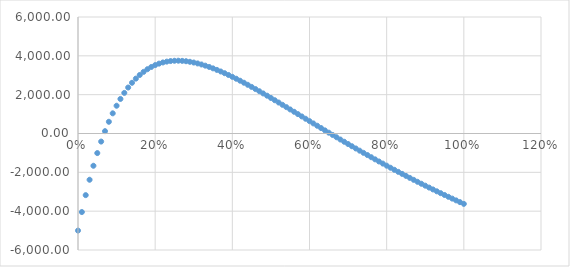
| Category | Series 0 |
|---|---|
| 0.0 | -5000 |
| 0.01 | -4044.767 |
| 0.02 | -3174.343 |
| 0.03 | -2382.082 |
| 0.04 | -1661.886 |
| 0.05 | -1008.153 |
| 0.060000000000000005 | -415.735 |
| 0.07 | 120.099 |
| 0.08 | 603.703 |
| 0.09 | 1039.086 |
| 0.09999999999999999 | 1429.938 |
| 0.10999999999999999 | 1779.662 |
| 0.11999999999999998 | 2091.393 |
| 0.12999999999999998 | 2368.025 |
| 0.13999999999999999 | 2612.226 |
| 0.15 | 2826.464 |
| 0.16 | 3013.013 |
| 0.17 | 3173.98 |
| 0.18000000000000002 | 3311.31 |
| 0.19000000000000003 | 3426.801 |
| 0.20000000000000004 | 3522.119 |
| 0.21000000000000005 | 3598.806 |
| 0.22000000000000006 | 3658.287 |
| 0.23000000000000007 | 3701.885 |
| 0.24000000000000007 | 3730.824 |
| 0.25000000000000006 | 3746.24 |
| 0.26000000000000006 | 3749.184 |
| 0.2700000000000001 | 3740.633 |
| 0.2800000000000001 | 3721.492 |
| 0.2900000000000001 | 3692.601 |
| 0.3000000000000001 | 3654.739 |
| 0.3100000000000001 | 3608.63 |
| 0.3200000000000001 | 3554.946 |
| 0.3300000000000001 | 3494.311 |
| 0.34000000000000014 | 3427.305 |
| 0.35000000000000014 | 3354.465 |
| 0.36000000000000015 | 3276.291 |
| 0.37000000000000016 | 3193.25 |
| 0.38000000000000017 | 3105.771 |
| 0.3900000000000002 | 3014.258 |
| 0.4000000000000002 | 2919.081 |
| 0.4100000000000002 | 2820.589 |
| 0.4200000000000002 | 2719.103 |
| 0.4300000000000002 | 2614.923 |
| 0.4400000000000002 | 2508.326 |
| 0.45000000000000023 | 2399.572 |
| 0.46000000000000024 | 2288.901 |
| 0.47000000000000025 | 2176.536 |
| 0.48000000000000026 | 2062.683 |
| 0.49000000000000027 | 1947.537 |
| 0.5000000000000002 | 1831.276 |
| 0.5100000000000002 | 1714.065 |
| 0.5200000000000002 | 1596.06 |
| 0.5300000000000002 | 1477.402 |
| 0.5400000000000003 | 1358.225 |
| 0.5500000000000003 | 1238.652 |
| 0.5600000000000003 | 1118.796 |
| 0.5700000000000003 | 998.764 |
| 0.5800000000000003 | 878.653 |
| 0.5900000000000003 | 758.554 |
| 0.6000000000000003 | 638.55 |
| 0.6100000000000003 | 518.718 |
| 0.6200000000000003 | 399.13 |
| 0.6300000000000003 | 279.853 |
| 0.6400000000000003 | 160.945 |
| 0.6500000000000004 | 42.464 |
| 0.6600000000000004 | -75.54 |
| 0.6700000000000004 | -193.019 |
| 0.6800000000000004 | -309.929 |
| 0.6900000000000004 | -426.232 |
| 0.7000000000000004 | -541.892 |
| 0.7100000000000004 | -656.875 |
| 0.7200000000000004 | -771.15 |
| 0.7300000000000004 | -884.692 |
| 0.7400000000000004 | -997.476 |
| 0.7500000000000004 | -1109.478 |
| 0.7600000000000005 | -1220.68 |
| 0.7700000000000005 | -1331.063 |
| 0.7800000000000005 | -1440.611 |
| 0.7900000000000005 | -1549.311 |
| 0.8000000000000005 | -1657.149 |
| 0.8100000000000005 | -1764.116 |
| 0.8200000000000005 | -1870.201 |
| 0.8300000000000005 | -1975.397 |
| 0.8400000000000005 | -2079.698 |
| 0.8500000000000005 | -2183.096 |
| 0.8600000000000005 | -2285.59 |
| 0.8700000000000006 | -2387.174 |
| 0.8800000000000006 | -2487.847 |
| 0.8900000000000006 | -2587.607 |
| 0.9000000000000006 | -2686.453 |
| 0.9100000000000006 | -2784.385 |
| 0.9200000000000006 | -2881.406 |
| 0.9300000000000006 | -2977.514 |
| 0.9400000000000006 | -3072.714 |
| 0.9500000000000006 | -3167.007 |
| 0.9600000000000006 | -3260.397 |
| 0.9700000000000006 | -3352.886 |
| 0.9800000000000006 | -3444.481 |
| 0.9900000000000007 | -3535.183 |
| 1.0000000000000007 | -3625 |